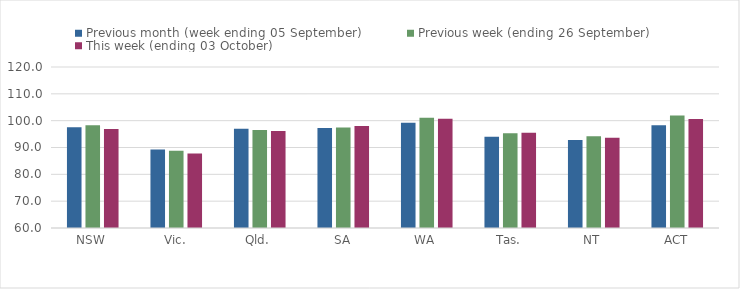
| Category | Previous month (week ending 05 September) | Previous week (ending 26 September) | This week (ending 03 October) |
|---|---|---|---|
| NSW | 97.53 | 98.25 | 96.9 |
| Vic. | 89.27 | 88.8 | 87.75 |
| Qld. | 97.01 | 96.5 | 96.13 |
| SA | 97.23 | 97.45 | 98.03 |
| WA | 99.22 | 101.12 | 100.71 |
| Tas. | 93.97 | 95.29 | 95.47 |
| NT | 92.81 | 94.15 | 93.61 |
| ACT | 98.32 | 101.89 | 100.58 |